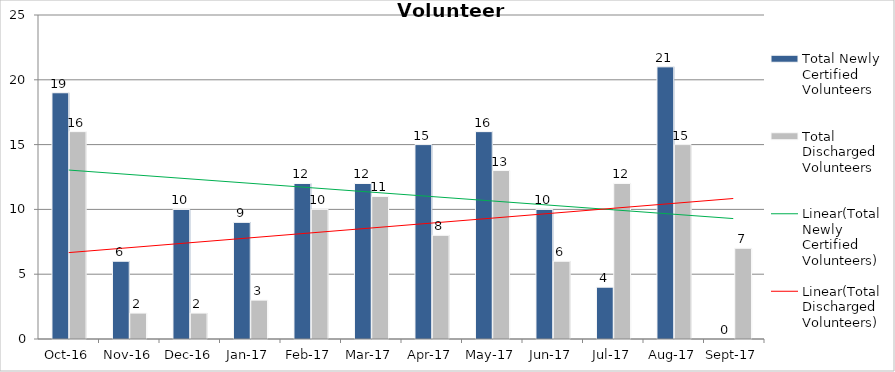
| Category | Total Newly Certified Volunteers | Total Discharged Volunteers |
|---|---|---|
| 2016-10-01 | 19 | 16 |
| 2016-11-01 | 6 | 2 |
| 2016-12-01 | 10 | 2 |
| 2017-01-01 | 9 | 3 |
| 2017-02-01 | 12 | 10 |
| 2017-03-01 | 12 | 11 |
| 2017-04-01 | 15 | 8 |
| 2017-05-01 | 16 | 13 |
| 2017-06-01 | 10 | 6 |
| 2017-07-01 | 4 | 12 |
| 2017-08-01 | 21 | 15 |
| 2017-09-01 | 0 | 7 |